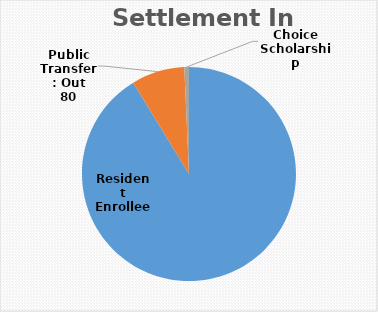
| Category | Series 0 |
|---|---|
| Resident Enrollee | 910 |
| Public Transfer: Out | 80 |
| Choice Scholarship | 7 |